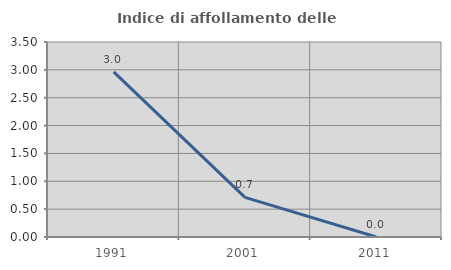
| Category | Indice di affollamento delle abitazioni  |
|---|---|
| 1991.0 | 2.963 |
| 2001.0 | 0.712 |
| 2011.0 | 0 |